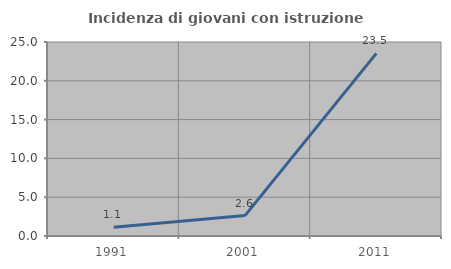
| Category | Incidenza di giovani con istruzione universitaria |
|---|---|
| 1991.0 | 1.124 |
| 2001.0 | 2.632 |
| 2011.0 | 23.529 |